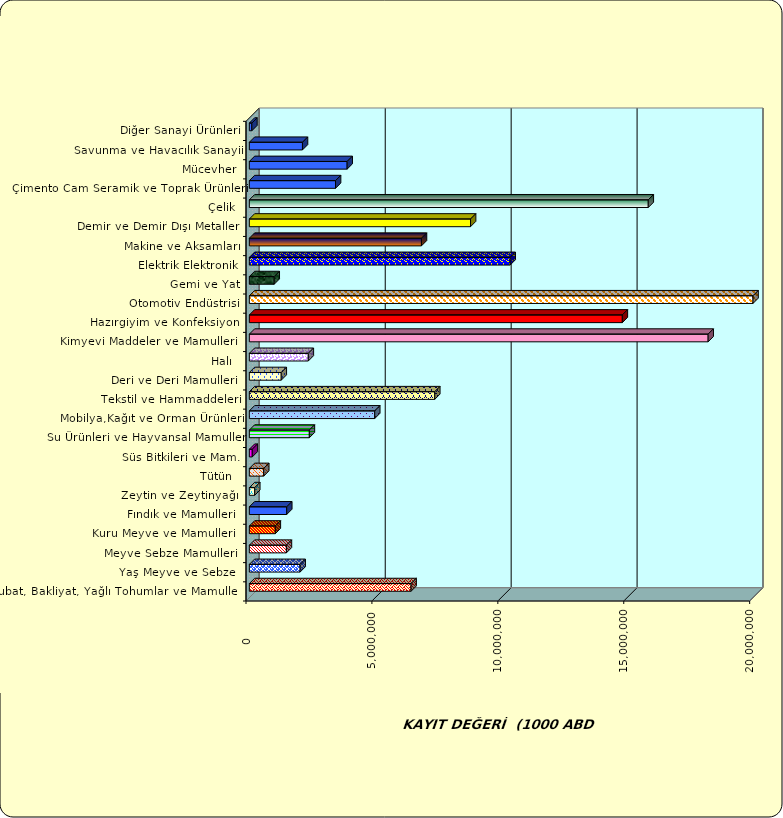
| Category | Series 0 |
|---|---|
|  Hububat, Bakliyat, Yağlı Tohumlar ve Mamulleri  | 6421891.615 |
|  Yaş Meyve ve Sebze   | 2016277.541 |
|  Meyve Sebze Mamulleri  | 1471172.851 |
|  Kuru Meyve ve Mamulleri   | 1030583.855 |
|  Fındık ve Mamulleri  | 1484411.215 |
|  Zeytin ve Zeytinyağı  | 214254.671 |
|  Tütün  | 571031.177 |
|  Süs Bitkileri ve Mam. | 116333.611 |
|  Su Ürünleri ve Hayvansal Mamuller | 2382799.391 |
|  Mobilya,Kağıt ve Orman Ürünleri | 4978457.108 |
|  Tekstil ve Hammaddeleri | 7362340.402 |
|  Deri ve Deri Mamulleri  | 1266630.16 |
|  Halı  | 2341016.693 |
|  Kimyevi Maddeler ve Mamulleri   | 18218193.037 |
|  Hazırgiyim ve Konfeksiyon  | 14810457.277 |
|  Otomotiv Endüstrisi | 21248339.222 |
|  Gemi ve Yat | 987213.789 |
|  Elektrik Elektronik | 10356832.562 |
|  Makine ve Aksamları | 6834335.076 |
|  Demir ve Demir Dışı Metaller  | 8783602.592 |
|  Çelik | 15840684.652 |
|  Çimento Cam Seramik ve Toprak Ürünleri | 3422079.05 |
|  Mücevher | 3883636.7 |
|  Savunma ve Havacılık Sanayii | 2109477.604 |
|  Diğer Sanayi Ürünleri | 98594.475 |